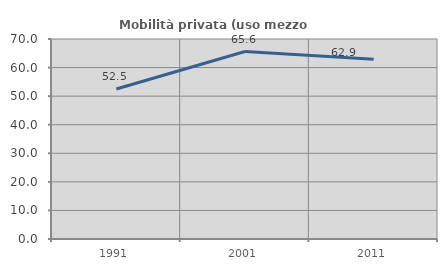
| Category | Mobilità privata (uso mezzo privato) |
|---|---|
| 1991.0 | 52.518 |
| 2001.0 | 65.613 |
| 2011.0 | 62.909 |